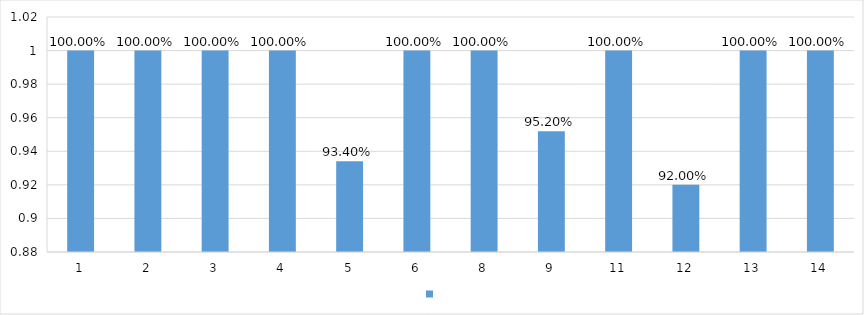
| Category | Series 0 |
|---|---|
| 1 | 1 |
| 2 | 1 |
| 3 | 1 |
| 4 | 1 |
| 5 | 0.934 |
| 6 | 1 |
| 8 | 1 |
| 9 | 0.952 |
| 11 | 1 |
| 12 | 0.92 |
| 13 | 1 |
| 14 | 1 |